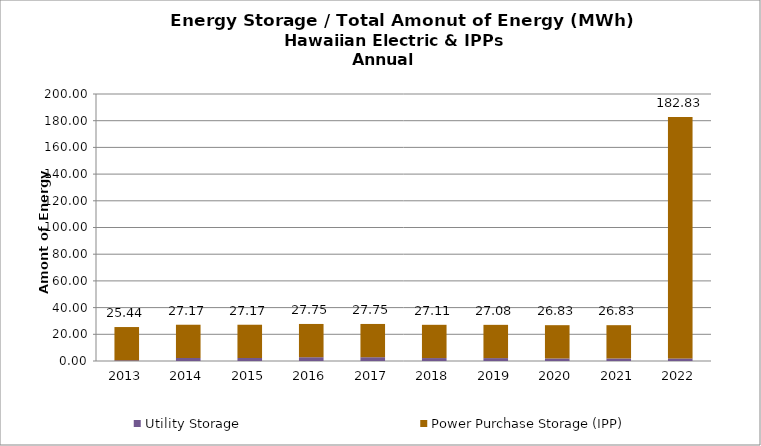
| Category | Utility Storage | Power Purchase Storage (IPP) |
|---|---|---|
| 2013.0 | 0.522 | 24.916 |
| 2014.0 | 2.251 | 24.916 |
| 2015.0 | 2.251 | 24.916 |
| 2016.0 | 2.834 | 24.916 |
| 2017.0 | 2.834 | 24.916 |
| 2018.0 | 2.197 | 24.916 |
| 2019.0 | 2.165 | 24.916 |
| 2020.0 | 1.915 | 24.916 |
| 2021.0 | 1.915 | 24.916 |
| 2022.0 | 1.915 | 180.916 |